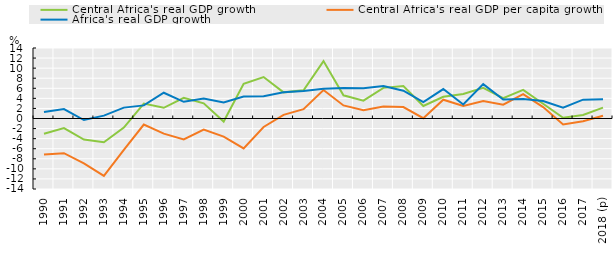
| Category | Central Africa's real GDP growth | Central Africa's real GDP per capita growth | Africa's real GDP growth  |
|---|---|---|---|
| 1990 | -3.026 | -7.134 | 1.279 |
| 1991 | -1.895 | -6.896 | 1.883 |
| 1992 | -4.192 | -8.925 | -0.307 |
| 1993 | -4.704 | -11.393 | 0.567 |
| 1994 | -1.796 | -6.232 | 2.16 |
| 1995 | 2.978 | -1.2 | 2.6 |
| 1996 | 2.124 | -3.004 | 5.112 |
| 1997 | 4.117 | -4.141 | 3.311 |
| 1998 | 3.016 | -2.19 | 3.974 |
| 1999 | -0.611 | -3.584 | 3.17 |
| 2000 | 6.897 | -5.944 | 4.347 |
| 2001 | 8.239 | -1.681 | 4.439 |
| 2002 | 5.193 | 0.714 | 5.19 |
| 2003 | 5.588 | 1.851 | 5.443 |
| 2004 | 11.399 | 5.653 | 5.886 |
| 2005 | 4.603 | 2.591 | 6.047 |
| 2006 | 3.549 | 1.625 | 6.005 |
| 2007 | 6.086 | 2.375 | 6.472 |
| 2008 | 6.449 | 2.264 | 5.512 |
| 2009 | 2.479 | 0.056 | 3.27 |
| 2010 | 4.32 | 3.733 | 5.844 |
| 2011 | 4.877 | 2.483 | 2.775 |
| 2012 | 6.077 | 3.448 | 6.828 |
| 2013 | 4.04 | 2.748 | 3.765 |
| 2014 | 5.694 | 4.839 | 3.875 |
| 2015 | 2.919 | 2.268 | 3.464 |
| 2016 | 0.152 | -1.185 | 2.159 |
| 2017 | 0.707 | -0.542 | 3.74 |
| 2018 (p) | 2.168 | 0.532 | 3.829 |